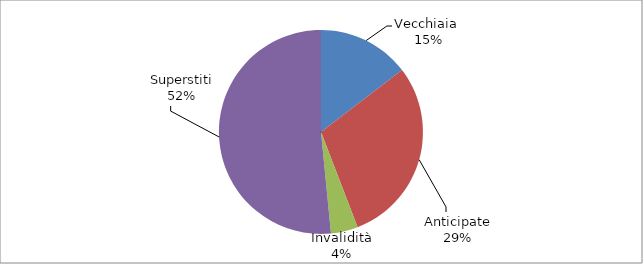
| Category | Series 0 |
|---|---|
| Vecchiaia  | 5148 |
| Anticipate | 10414 |
| Invalidità | 1510 |
| Superstiti | 18172 |